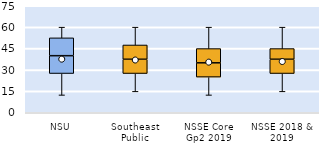
| Category | 25th | 50th | 75th |
|---|---|---|---|
| NSU | 27.5 | 12.5 | 12.5 |
| Southeast Public | 27.5 | 10 | 10 |
| NSSE Core Gp2 2019 | 25 | 10 | 10 |
| NSSE 2018 & 2019 | 27.5 | 10 | 7.5 |